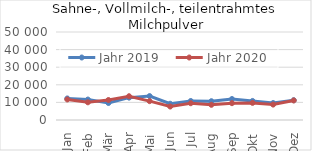
| Category | Jahr 2019 | Jahr 2020 |
|---|---|---|
| Jan | 12242.279 | 11678.063 |
| Feb | 11625.254 | 10058.15 |
| Mär | 9645.491 | 11362.798 |
| Apr | 12709.082 | 13499.656 |
| Mai | 13596.717 | 10711.772 |
| Jun | 9228.763 | 7651.07 |
| Jul | 10794.812 | 9531.594 |
| Aug | 10667.536 | 8632.257 |
| Sep | 11912.859 | 9564.417 |
| Okt | 10824.272 | 9725.885 |
| Nov | 9641.022 | 8757.566 |
| Dez | 11246.861 | 11105.63 |